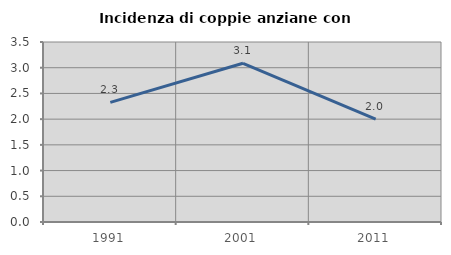
| Category | Incidenza di coppie anziane con figli |
|---|---|
| 1991.0 | 2.326 |
| 2001.0 | 3.086 |
| 2011.0 | 2 |